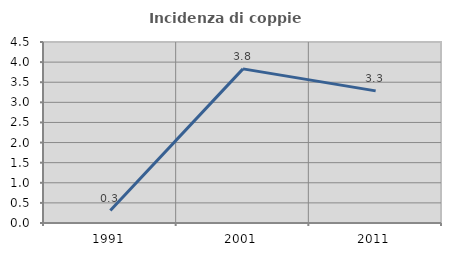
| Category | Incidenza di coppie miste |
|---|---|
| 1991.0 | 0.311 |
| 2001.0 | 3.831 |
| 2011.0 | 3.285 |